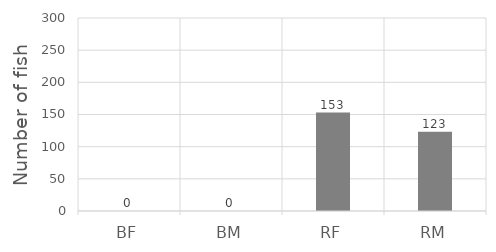
| Category | Series 0 |
|---|---|
| BF | 0 |
| BM | 0 |
| RF | 153 |
| RM | 123 |